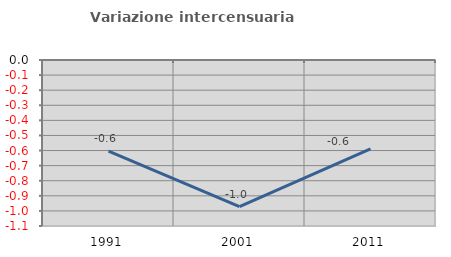
| Category | Variazione intercensuaria annua |
|---|---|
| 1991.0 | -0.603 |
| 2001.0 | -0.971 |
| 2011.0 | -0.588 |